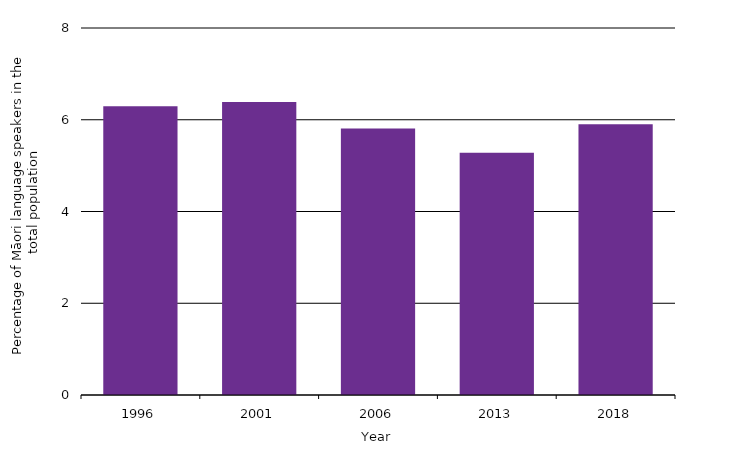
| Category | Percent of Māori language speakers in the total population |
|---|---|
| 1996.0 | 6.293 |
| 2001.0 | 6.387 |
| 2006.0 | 5.81 |
| 2013.0 | 5.278 |
| 2018.0 | 5.9 |